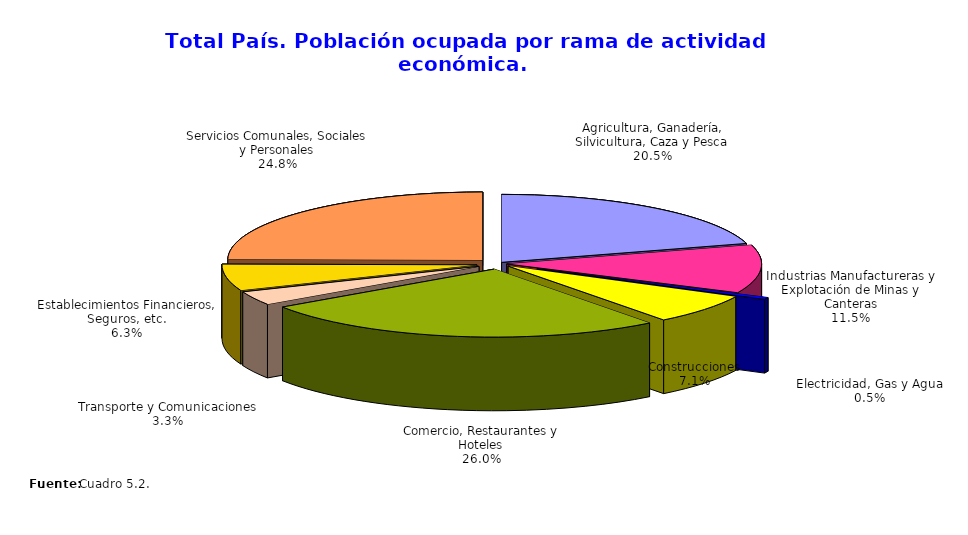
| Category | Series 0 |
|---|---|
| Agricultura, Ganadería, Silvicultura, Caza y Pesca | 691850 |
| Industrias Manufactureras y Explotación de Minas y Canteras | 386391 |
| Electricidad, Gas y Agua | 16504 |
| Construcciones | 240102 |
| Comercio, Restaurantes y Hoteles | 877995 |
| Transporte y Comunicaciones | 110884 |
| Establecimientos Financieros, Seguros, etc. | 212383 |
| Servicios Comunales, Sociales y Personales | 838165 |